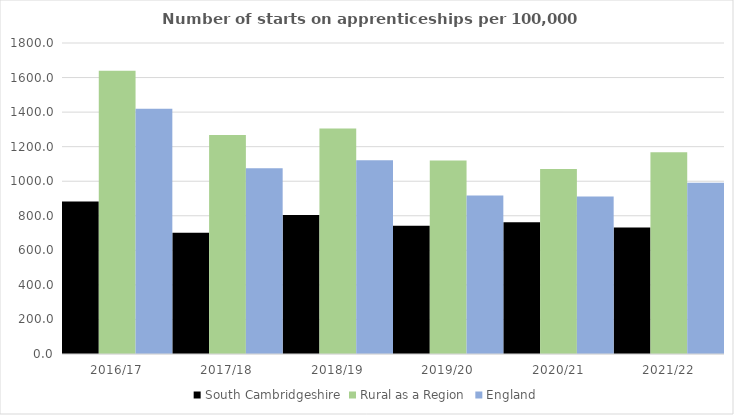
| Category | South Cambridgeshire | Rural as a Region | England |
|---|---|---|---|
| 2016/17 | 882 | 1638.789 | 1420 |
| 2017/18 | 702 | 1267.474 | 1075 |
| 2018/19 | 805 | 1304.57 | 1122 |
| 2019/20 | 743 | 1119.662 | 918 |
| 2020/21 | 762 | 1070.748 | 912 |
| 2021/22 | 732 | 1167.68 | 991 |